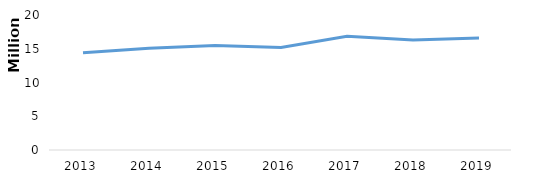
| Category | Number of Nights  |
|---|---|
| 2013.0 | 14393834.961 |
| 2014.0 | 15082370.55 |
| 2015.0 | 15470769.292 |
| 2016.0 | 15174830 |
| 2017.0 | 16866127.324 |
| 2018.0 | 16296184 |
| 2019.0 | 16583419.336 |